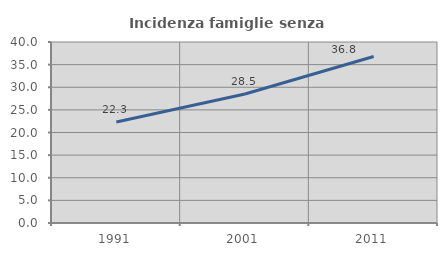
| Category | Incidenza famiglie senza nuclei |
|---|---|
| 1991.0 | 22.308 |
| 2001.0 | 28.506 |
| 2011.0 | 36.789 |